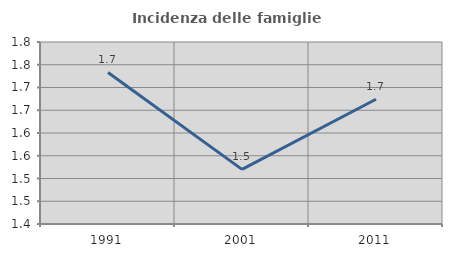
| Category | Incidenza delle famiglie numerose |
|---|---|
| 1991.0 | 1.733 |
| 2001.0 | 1.52 |
| 2011.0 | 1.674 |